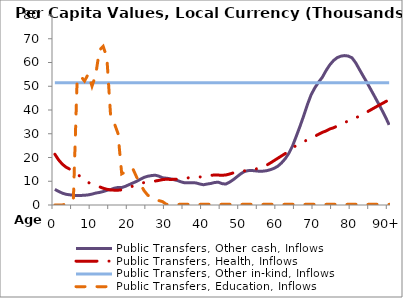
| Category | Public Transfers, Other cash, Inflows | Public Transfers, Health, Inflows | Public Transfers, Other in-kind, Inflows | Public Transfers, Education, Inflows |
|---|---|---|---|---|
| 0 | 6575.11 | 21366.293 | 51467.833 | 0 |
|  | 5739.033 | 19006.039 | 51467.833 | 0 |
| 2 | 5004.766 | 17199.093 | 51467.833 | 0 |
| 3 | 4503.576 | 15936.454 | 51467.833 | 414.086 |
| 4 | 4289.072 | 15100.649 | 51467.833 | 1238.128 |
| 5 | 4086.509 | 14126.189 | 51467.833 | 2963.942 |
| 6 | 3982.31 | 13030.852 | 51467.833 | 52841.807 |
| 7 | 4025.948 | 11784.735 | 51467.833 | 54125.96 |
| 8 | 4100.544 | 10494.638 | 51467.833 | 52168.653 |
| 9 | 4266.024 | 9485.493 | 51467.833 | 55252.233 |
| 10 | 4581.878 | 8810.74 | 51467.833 | 50059.866 |
| 11 | 5021.861 | 8207.849 | 51467.833 | 54763.329 |
| 12 | 5281.149 | 7649.654 | 51467.833 | 65184.795 |
| 13 | 5657.483 | 7083.788 | 51467.833 | 66794.328 |
| 14 | 6179.707 | 6612.145 | 51467.833 | 62189.54 |
| 15 | 6473.45 | 6347.695 | 51467.833 | 37798.037 |
| 16 | 7079.278 | 6238.451 | 51467.833 | 34403.961 |
| 17 | 7398.019 | 6232.85 | 51467.833 | 30107.215 |
| 18 | 7358.417 | 6369.726 | 51467.833 | 13100.769 |
| 19 | 7866.461 | 6688.032 | 51467.833 | 13947.154 |
| 20 | 8577.668 | 7221.659 | 51467.833 | 15100.784 |
| 21 | 9264.945 | 7994.837 | 51467.833 | 15246.95 |
| 22 | 9943.687 | 8656.764 | 51467.833 | 11802.219 |
| 23 | 10817.129 | 9137.356 | 51467.833 | 8934.273 |
| 24 | 11618.848 | 9434.568 | 51467.833 | 6095.017 |
| 25 | 12103.443 | 9650.155 | 51467.833 | 4152.1 |
| 26 | 12381.653 | 9841.447 | 51467.833 | 3148.379 |
| 27 | 12552.989 | 10095.022 | 51467.833 | 2346.637 |
| 28 | 12151.28 | 10357.709 | 51467.833 | 1848.799 |
| 29 | 11457.121 | 10691.888 | 51467.833 | 1423.2 |
| 30 | 11288.175 | 10837.322 | 51467.833 | 284.259 |
| 31 | 11070.951 | 10769.71 | 51467.833 | 284.259 |
| 32 | 10669.243 | 10801.265 | 51467.833 | 284.259 |
| 33 | 10309.32 | 10869.617 | 51467.833 | 284.259 |
| 34 | 9730.984 | 10978.969 | 51467.833 | 284.259 |
| 35 | 9332.591 | 11169.899 | 51467.833 | 284.259 |
| 36 | 9336.924 | 11447.262 | 51467.833 | 284.259 |
| 37 | 9353.099 | 11661.994 | 51467.833 | 284.259 |
| 38 | 9306.277 | 11710.359 | 51467.833 | 284.259 |
| 39 | 8850.03 | 11813.177 | 51467.833 | 284.259 |
| 40 | 8526.691 | 11850.394 | 51467.833 | 284.259 |
| 41 | 8837.486 | 12209.747 | 51467.833 | 284.259 |
| 42 | 9066.413 | 12523.601 | 51467.833 | 284.259 |
| 43 | 9471.135 | 12616.249 | 51467.833 | 284.259 |
| 44 | 9600.845 | 12595.153 | 51467.833 | 284.259 |
| 45 | 9006.884 | 12521.368 | 51467.833 | 284.259 |
| 46 | 8816.934 | 12630.06 | 51467.833 | 284.259 |
| 47 | 9592.735 | 13021.514 | 51467.833 | 284.259 |
| 48 | 10615.255 | 13508.836 | 51467.833 | 284.259 |
| 49 | 11846.986 | 13826.612 | 51467.833 | 284.259 |
| 50 | 13088.595 | 14116.505 | 51467.833 | 284.259 |
| 51 | 14075.257 | 14365.741 | 51467.833 | 284.259 |
| 52 | 14462.105 | 14616.119 | 51467.833 | 284.259 |
| 53 | 14532.261 | 14795.299 | 51467.833 | 284.259 |
| 54 | 14372.236 | 15107.85 | 51467.833 | 284.259 |
| 55 | 14221.687 | 15563.548 | 51467.833 | 284.259 |
| 56 | 14250.883 | 16090.784 | 51467.833 | 284.259 |
| 57 | 14435.038 | 16766.273 | 51467.833 | 284.259 |
| 58 | 14849.171 | 17666.482 | 51467.833 | 284.259 |
| 59 | 15436.727 | 18665.453 | 51467.833 | 284.259 |
| 60 | 16291.023 | 19654.835 | 51467.833 | 284.259 |
| 61 | 17676.755 | 20647.335 | 51467.833 | 284.259 |
| 62 | 19447.293 | 21630.175 | 51467.833 | 284.259 |
| 63 | 21768.754 | 22774.791 | 51467.833 | 284.259 |
| 64 | 24887.26 | 24013.066 | 51467.833 | 284.259 |
| 65 | 28958.106 | 25059.557 | 51467.833 | 284.259 |
| 66 | 33139.534 | 25891.024 | 51467.833 | 284.259 |
| 67 | 37569.967 | 26662.153 | 51467.833 | 284.259 |
| 68 | 42302.452 | 27474.399 | 51467.833 | 284.259 |
| 69 | 46440.733 | 28368.96 | 51467.833 | 284.259 |
| 70 | 49348.922 | 29003.15 | 51467.833 | 284.259 |
| 71 | 51715.083 | 29751.958 | 51467.833 | 284.259 |
| 72 | 53754.208 | 30583.817 | 51467.833 | 284.259 |
| 73 | 56567.041 | 31163.6 | 51467.833 | 284.259 |
| 74 | 58962.112 | 31995.234 | 51467.833 | 284.259 |
| 75 | 60786.406 | 32510.704 | 51467.833 | 284.259 |
| 76 | 62030.453 | 33191.535 | 51467.833 | 284.259 |
| 77 | 62670.558 | 33915.688 | 51467.833 | 284.259 |
| 78 | 62909.303 | 34682.028 | 51467.833 | 284.259 |
| 79 | 62707.523 | 35395.415 | 51467.833 | 284.259 |
| 80 | 61958.727 | 36053.531 | 51467.833 | 284.259 |
| 81 | 59860.956 | 36686.141 | 51467.833 | 284.259 |
| 82 | 57071.681 | 37440.671 | 51467.833 | 284.259 |
| 83 | 54328.905 | 38258.191 | 51467.833 | 284.259 |
| 84 | 51652.231 | 39124.798 | 51467.833 | 284.259 |
| 85 | 48795.948 | 40010.449 | 51467.833 | 284.259 |
| 86 | 45955.478 | 40895.691 | 51467.833 | 284.259 |
| 87 | 43080.221 | 41767.739 | 51467.833 | 284.259 |
| 88 | 40139.225 | 42624.22 | 51467.833 | 284.259 |
| 89 | 37102.167 | 43471.737 | 51467.833 | 284.259 |
| 90+ | 33732.855 | 44337.833 | 51467.833 | 284.259 |